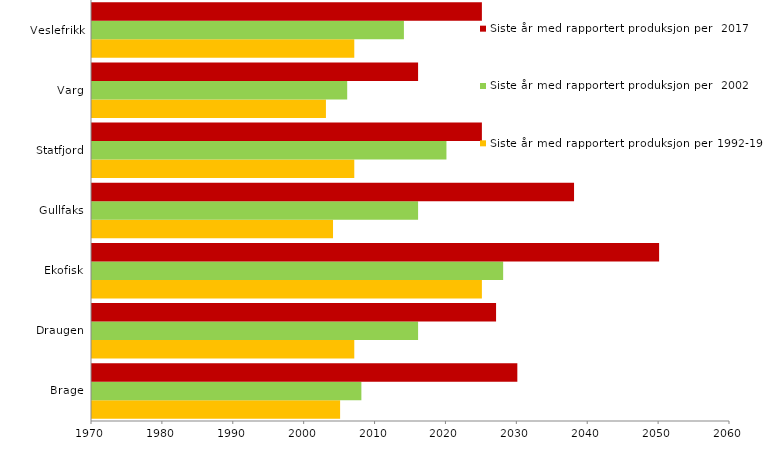
| Category | Siste år med rapportert produksjon per 1992-1995 | Siste år med rapportert produksjon per  2002 | Siste år med rapportert produksjon per  2017 |
|---|---|---|---|
| Brage | 2005 | 2008 | 2030 |
| Draugen | 2007 | 2016 | 2027 |
| Ekofisk | 2025 | 2028 | 2050 |
| Gullfaks | 2004 | 2016 | 2038 |
| Statfjord | 2007 | 2020 | 2025 |
| Varg | 2003 | 2006 | 2016 |
| Veslefrikk | 2007 | 2014 | 2025 |